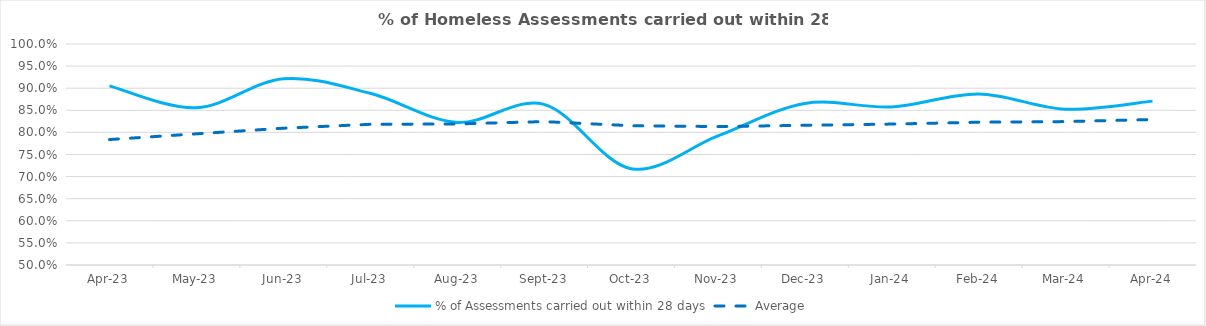
| Category | % of Assessments carried out within 28 days | Average |
|---|---|---|
| 2023-04-01 | 0.905 | 0.784 |
| 2023-05-01 | 0.856 | 0.797 |
| 2023-06-01 | 0.921 | 0.809 |
| 2023-07-01 | 0.888 | 0.818 |
| 2023-08-01 | 0.823 | 0.819 |
| 2023-09-01 | 0.863 | 0.824 |
| 2023-10-01 | 0.718 | 0.815 |
| 2023-11-01 | 0.792 | 0.813 |
| 2023-12-01 | 0.866 | 0.816 |
| 2024-01-01 | 0.858 | 0.819 |
| 2024-02-01 | 0.887 | 0.823 |
| 2024-03-01 | 0.852 | 0.824 |
| 2024-04-01 | 0.871 | 0.829 |